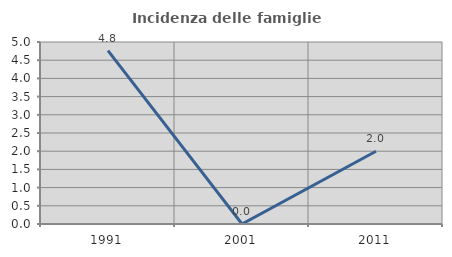
| Category | Incidenza delle famiglie numerose |
|---|---|
| 1991.0 | 4.762 |
| 2001.0 | 0 |
| 2011.0 | 2 |